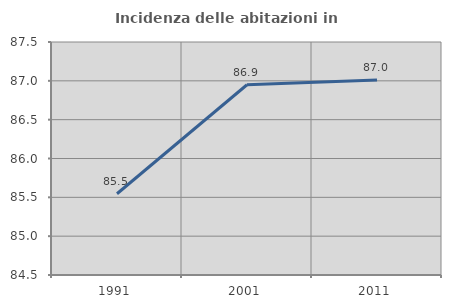
| Category | Incidenza delle abitazioni in proprietà  |
|---|---|
| 1991.0 | 85.546 |
| 2001.0 | 86.949 |
| 2011.0 | 87.012 |